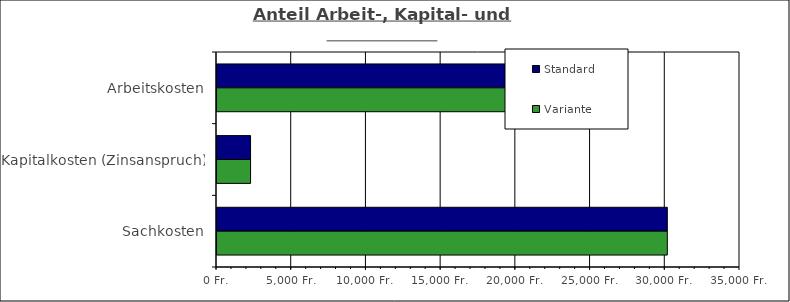
| Category | Standard | Variante  |
|---|---|---|
| Arbeitskosten | 19523.461 | 19523.461 |
| Kapitalkosten (Zinsanspruch) | 2245.498 | 2245.501 |
| Sachkosten | 30135.691 | 30135.717 |